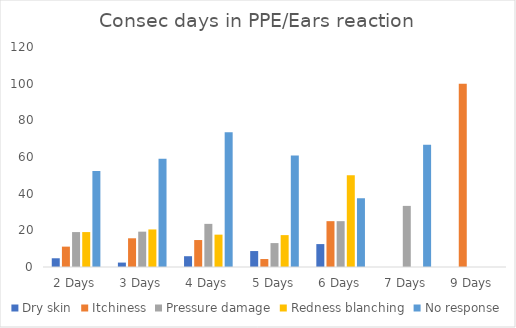
| Category | Dry skin | Itchiness | Pressure damage | Redness blanching | No response |
|---|---|---|---|---|---|
| 2 Days | 4.762 | 11.111 | 19.048 | 19.048 | 52.381 |
| 3 Days | 2.41 | 15.663 | 19.277 | 20.482 | 59.036 |
| 4 Days | 5.882 | 14.706 | 23.529 | 17.647 | 73.529 |
| 5 Days | 8.696 | 4.348 | 13.043 | 17.391 | 60.87 |
| 6 Days | 12.5 | 25 | 25 | 50 | 37.5 |
| 7 Days | 0 | 0 | 33.333 | 0 | 66.667 |
| 9 Days | 0 | 100 | 0 | 0 | 0 |